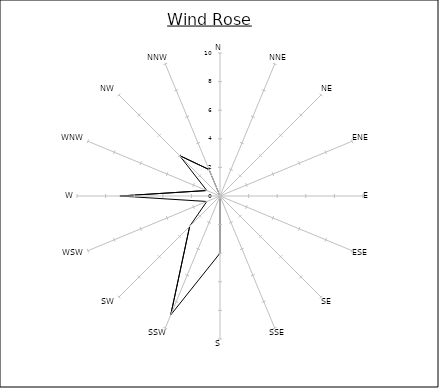
| Category | Series 0 |
|---|---|
| N | 0 |
| NNE | 0 |
| NE | 0 |
| ENE | 0 |
| E | 0 |
| ESE | 0 |
| SE | 0 |
| SSE | 0 |
| S | 4 |
| SSW | 9 |
| SW | 3 |
| WSW | 1 |
| W | 7 |
| WNW | 1 |
| NW | 4 |
| NNW | 2 |